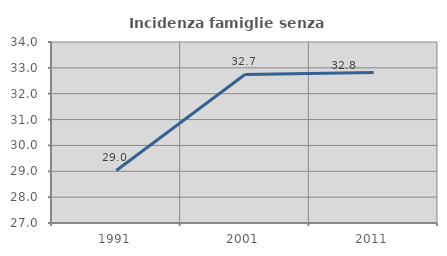
| Category | Incidenza famiglie senza nuclei |
|---|---|
| 1991.0 | 29.031 |
| 2001.0 | 32.744 |
| 2011.0 | 32.82 |